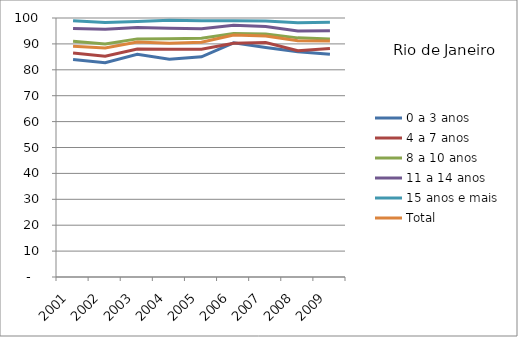
| Category | 0 a 3 anos | 4 a 7 anos | 8 a 10 anos | 11 a 14 anos | 15 anos e mais | Total |
|---|---|---|---|---|---|---|
| 2001.0 | 83.95 | 86.45 | 91.05 | 95.94 | 98.97 | 89.08 |
| 2002.0 | 82.74 | 85.22 | 89.95 | 95.65 | 98.24 | 88.4 |
| 2003.0 | 85.95 | 88 | 91.94 | 96.33 | 98.64 | 90.71 |
| 2004.0 | 84.05 | 87.93 | 92.01 | 96.08 | 99.09 | 90.23 |
| 2005.0 | 85.02 | 87.9 | 92.19 | 95.88 | 98.9 | 90.66 |
| 2006.0 | 90.39 | 90.26 | 93.97 | 97.19 | 98.93 | 93.45 |
| 2007.0 | 88.57 | 90.54 | 93.8 | 96.75 | 98.85 | 93.03 |
| 2008.0 | 86.94 | 87.38 | 92.33 | 95.02 | 98.2 | 91.23 |
| 2009.0 | 86 | 88.24 | 91.89 | 95.08 | 98.32 | 91.15 |